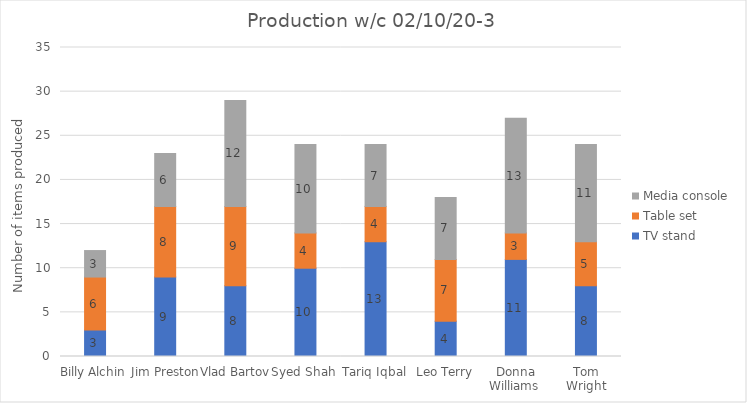
| Category | TV stand | Table set | Media console |
|---|---|---|---|
| Billy Alchin  | 3 | 6 | 3 |
| Jim Preston | 9 | 8 | 6 |
| Vlad Bartov | 8 | 9 | 12 |
| Syed Shah | 10 | 4 | 10 |
| Tariq Iqbal | 13 | 4 | 7 |
| Leo Terry | 4 | 7 | 7 |
| Donna Williams  | 11 | 3 | 13 |
| Tom Wright | 8 | 5 | 11 |